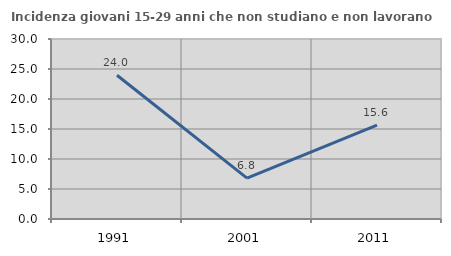
| Category | Incidenza giovani 15-29 anni che non studiano e non lavorano  |
|---|---|
| 1991.0 | 23.953 |
| 2001.0 | 6.803 |
| 2011.0 | 15.642 |